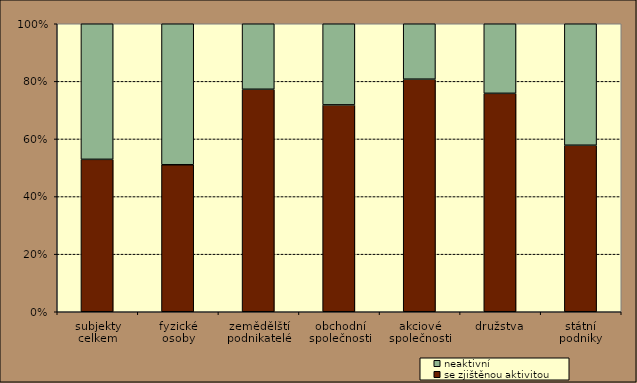
| Category | se zjištěnou aktivitou | neaktivní |
|---|---|---|
| subjekty
celkem | 52.922 | 47.078 |
| fyzické
osoby | 51.044 | 48.956 |
| zemědělští podnikatelé | 77.252 | 22.748 |
| obchodní
společnosti | 71.831 | 28.169 |
| akciové
společnosti | 80.754 | 19.246 |
| družstva | 75.845 | 24.155 |
| státní
podniky | 57.823 | 42.177 |